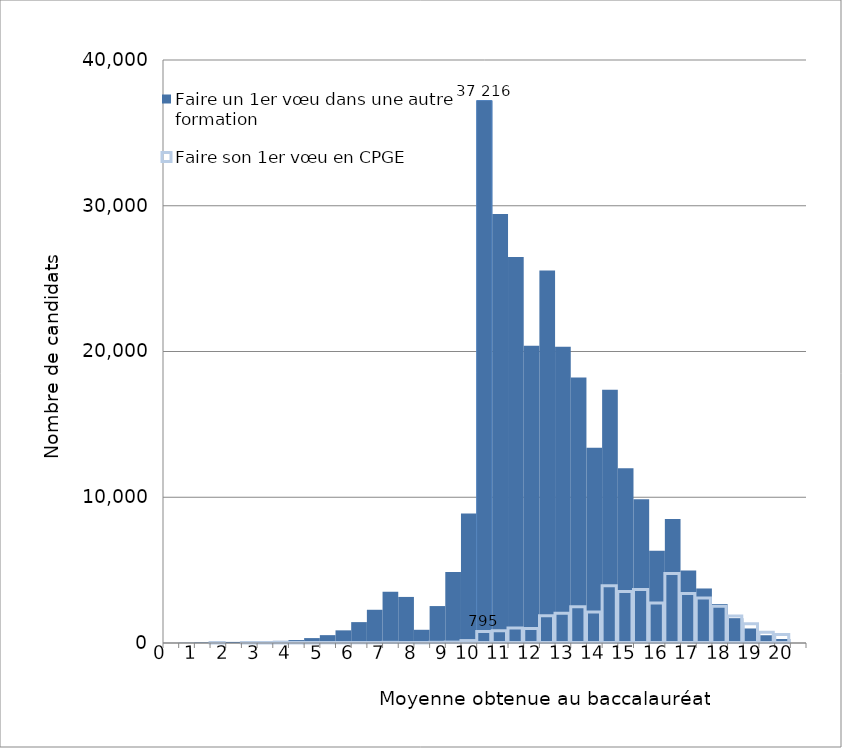
| Category | Faire un 1er vœu dans une autre formation | Faire son 1er vœu en CPGE |
|---|---|---|
| 0.0 | 5 | 0 |
| 0.5 | 17 | 0 |
| 1.0 | 38 | 0 |
| 1.5 | 50 | 1 |
| 2.0 | 75 | 0 |
| 2.5 | 100 | 2 |
| 3.0 | 121 | 1 |
| 3.5 | 148 | 4 |
| 4.0 | 201 | 3 |
| 4.5 | 337 | 3 |
| 5.0 | 539 | 12 |
| 5.5 | 868 | 12 |
| 6.0 | 1433 | 16 |
| 6.5 | 2280 | 20 |
| 7.0 | 3522 | 45 |
| 7.5 | 3161 | 34 |
| 8.0 | 907 | 9 |
| 8.5 | 2534 | 47 |
| 9.0 | 4868 | 61 |
| 9.5 | 8884 | 167 |
| 10.0 | 37216 | 795 |
| 10.5 | 29431 | 846 |
| 11.0 | 26484 | 1036 |
| 11.5 | 20386 | 993 |
| 12.0 | 25565 | 1876 |
| 12.5 | 20333 | 2047 |
| 13.0 | 18220 | 2495 |
| 13.5 | 13399 | 2135 |
| 14.0 | 17371 | 3921 |
| 14.5 | 11987 | 3540 |
| 15.0 | 9870 | 3663 |
| 15.5 | 6324 | 2753 |
| 16.0 | 8509 | 4764 |
| 16.5 | 4979 | 3400 |
| 17.0 | 3741 | 3079 |
| 17.5 | 2675 | 2524 |
| 18.0 | 1704 | 1860 |
| 18.5 | 996 | 1325 |
| 19.0 | 533 | 744 |
| 19.5 | 275 | 585 |
| 20.0 | 0 | 0 |